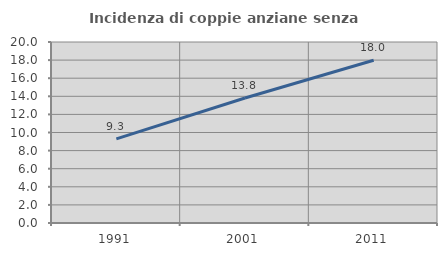
| Category | Incidenza di coppie anziane senza figli  |
|---|---|
| 1991.0 | 9.296 |
| 2001.0 | 13.812 |
| 2011.0 | 17.987 |